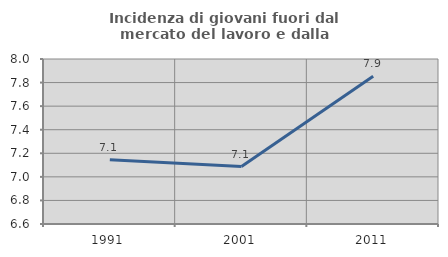
| Category | Incidenza di giovani fuori dal mercato del lavoro e dalla formazione  |
|---|---|
| 1991.0 | 7.146 |
| 2001.0 | 7.087 |
| 2011.0 | 7.854 |